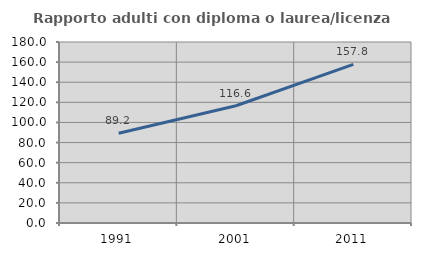
| Category | Rapporto adulti con diploma o laurea/licenza media  |
|---|---|
| 1991.0 | 89.202 |
| 2001.0 | 116.602 |
| 2011.0 | 157.791 |